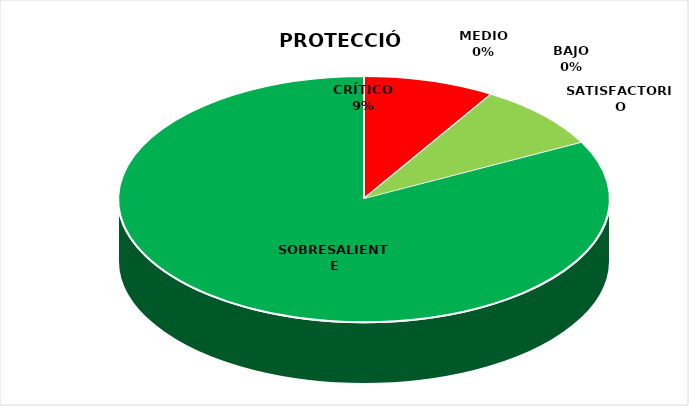
| Category | Series 0 |
|---|---|
| CRÍTICO | 2 |
| BAJO | 0 |
| MEDIO | 0 |
| SATISFACTORIO | 2 |
| SOBRESALIENTE | 19 |